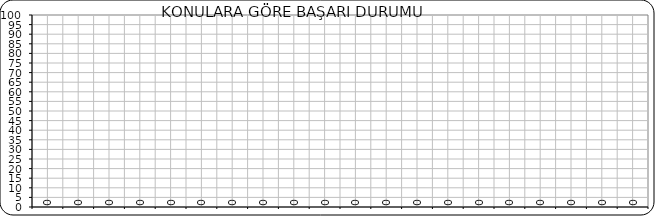
| Category | Series 0 |
|---|---|
|  | 0 |
|  | 0 |
|  | 0 |
|  | 0 |
|  | 0 |
|  | 0 |
|  | 0 |
|  | 0 |
|  | 0 |
|  | 0 |
|  | 0 |
|  | 0 |
|  | 0 |
|  | 0 |
|  | 0 |
|  | 0 |
|  | 0 |
|  | 0 |
|  | 0 |
|  | 0 |